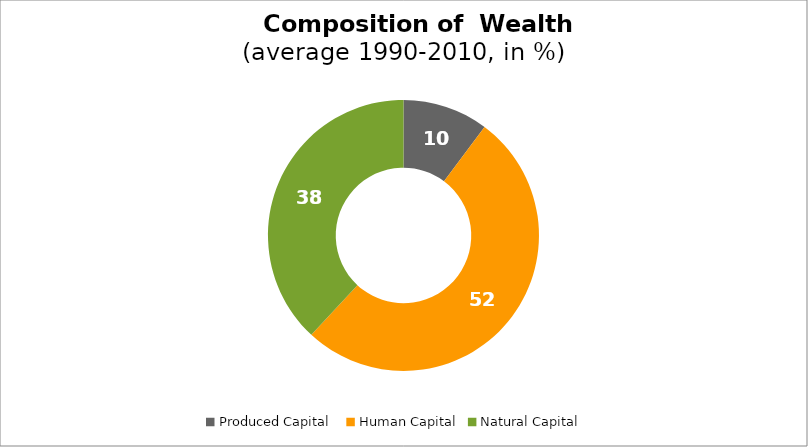
| Category | Series 0 |
|---|---|
| Produced Capital  | 10.203 |
| Human Capital | 51.703 |
| Natural Capital | 38.094 |